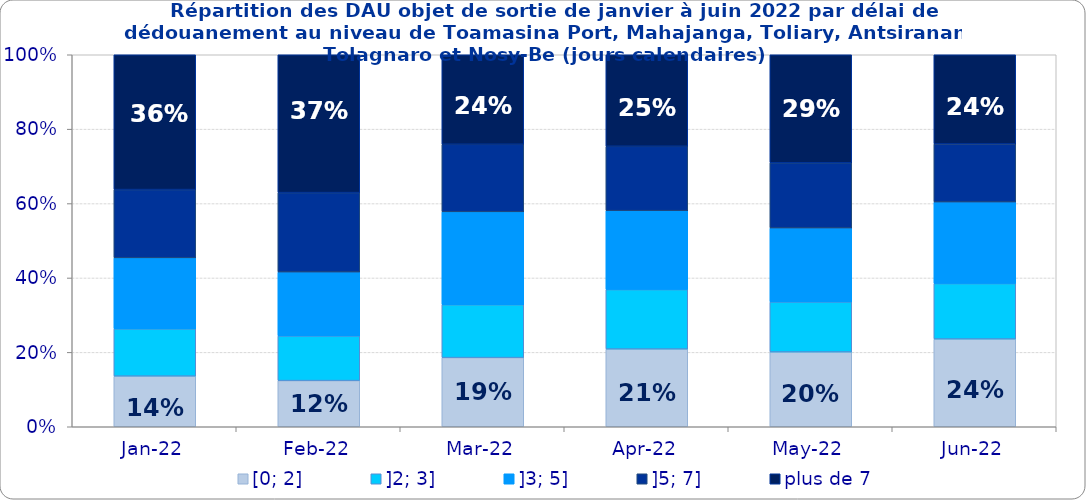
| Category | [0; 2] | ]2; 3] | ]3; 5] | ]5; 7] | plus de 7 |
|---|---|---|---|---|---|
| 2022-01-01 | 0.136 | 0.127 | 0.191 | 0.184 | 0.362 |
| 2022-02-01 | 0.124 | 0.12 | 0.172 | 0.213 | 0.371 |
| 2022-03-01 | 0.186 | 0.142 | 0.25 | 0.182 | 0.241 |
| 2022-04-01 | 0.209 | 0.16 | 0.212 | 0.173 | 0.246 |
| 2022-05-01 | 0.201 | 0.135 | 0.199 | 0.175 | 0.29 |
| 2022-06-01 | 0.236 | 0.149 | 0.219 | 0.156 | 0.24 |